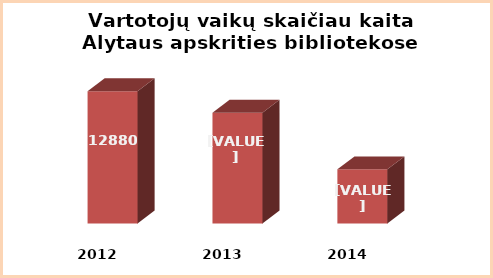
| Category | Series 0 |
|---|---|
| 2012.0 | 12880 |
| 2013.0 | 12753 |
| 2014.0 | 12419 |